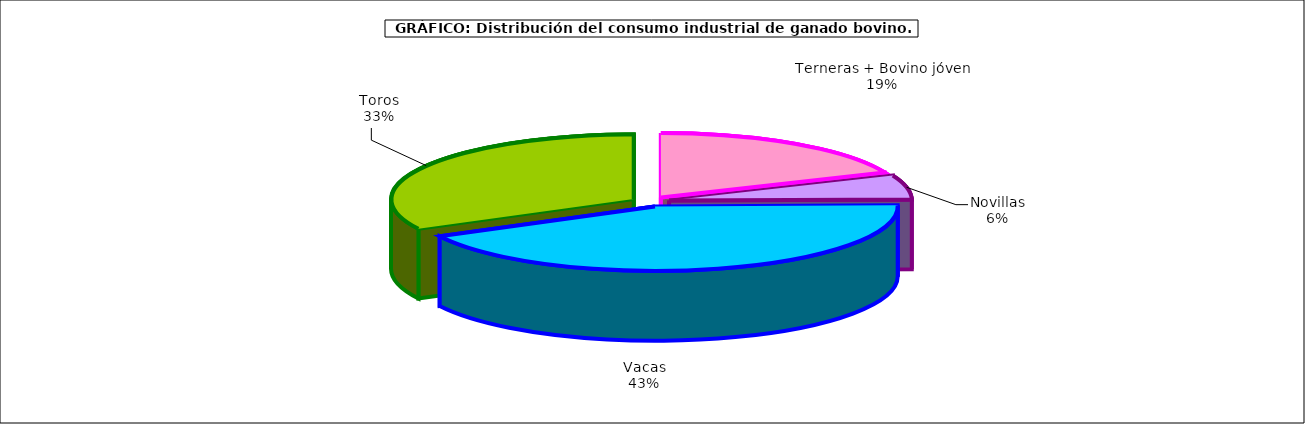
| Category | Series 0 |
|---|---|
| Terneras + Bovino jóven | 16163.787 |
| Novillas | 5234.507 |
| Vacas | 36950.194 |
| Toros | 28274.06 |